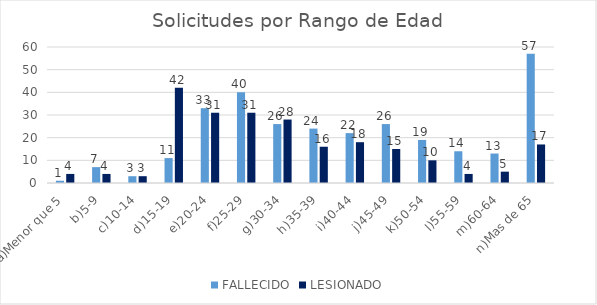
| Category | FALLECIDO | LESIONADO |
|---|---|---|
| a)Menor que 5 | 1 | 4 |
| b)5-9 | 7 | 4 |
| c)10-14 | 3 | 3 |
| d)15-19 | 11 | 42 |
| e)20-24 | 33 | 31 |
| f)25-29 | 40 | 31 |
| g)30-34 | 26 | 28 |
| h)35-39 | 24 | 16 |
| i)40-44 | 22 | 18 |
| j)45-49 | 26 | 15 |
| k)50-54 | 19 | 10 |
| l)55-59 | 14 | 4 |
| m)60-64 | 13 | 5 |
| n)Mas de 65 | 57 | 17 |